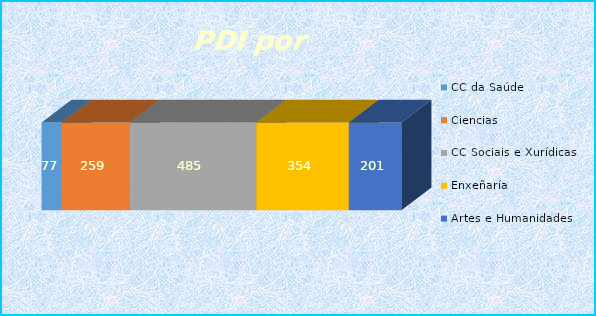
| Category | CC da Saúde | Ciencias | CC Sociais e Xurídicas | Enxeñaría | Artes e Humanidades |
|---|---|---|---|---|---|
| 0 | 77 | 259 | 485 | 354 | 201 |